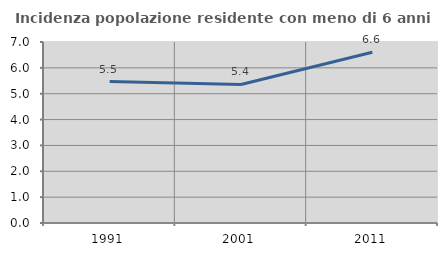
| Category | Incidenza popolazione residente con meno di 6 anni |
|---|---|
| 1991.0 | 5.472 |
| 2001.0 | 5.359 |
| 2011.0 | 6.602 |